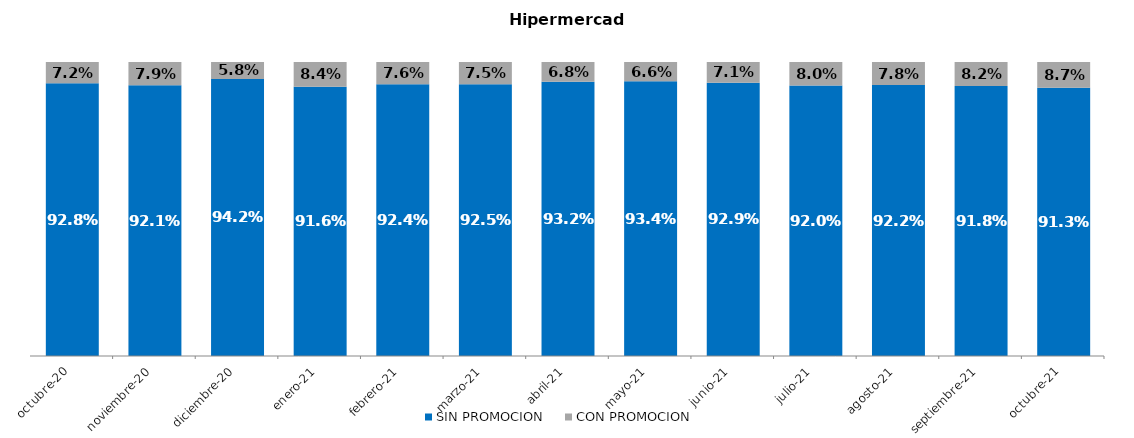
| Category | SIN PROMOCION   | CON PROMOCION   |
|---|---|---|
| 2020-10-01 | 0.928 | 0.072 |
| 2020-11-01 | 0.921 | 0.079 |
| 2020-12-01 | 0.942 | 0.058 |
| 2021-01-01 | 0.916 | 0.084 |
| 2021-02-01 | 0.924 | 0.076 |
| 2021-03-01 | 0.925 | 0.075 |
| 2021-04-01 | 0.932 | 0.068 |
| 2021-05-01 | 0.934 | 0.066 |
| 2021-06-01 | 0.929 | 0.071 |
| 2021-07-01 | 0.92 | 0.08 |
| 2021-08-01 | 0.922 | 0.078 |
| 2021-09-01 | 0.918 | 0.082 |
| 2021-10-01 | 0.913 | 0.087 |